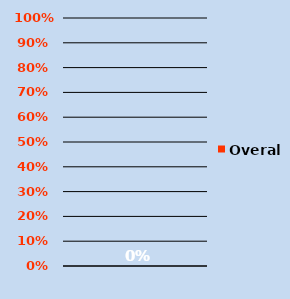
| Category | Overall |
|---|---|
| 0 | 0 |